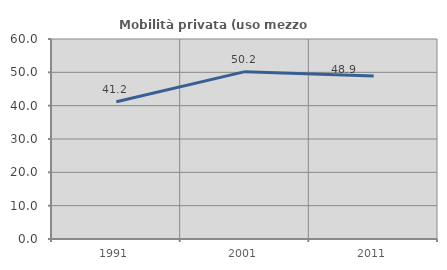
| Category | Mobilità privata (uso mezzo privato) |
|---|---|
| 1991.0 | 41.154 |
| 2001.0 | 50.207 |
| 2011.0 | 48.869 |